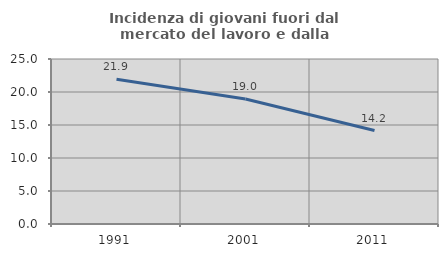
| Category | Incidenza di giovani fuori dal mercato del lavoro e dalla formazione  |
|---|---|
| 1991.0 | 21.938 |
| 2001.0 | 18.951 |
| 2011.0 | 14.16 |